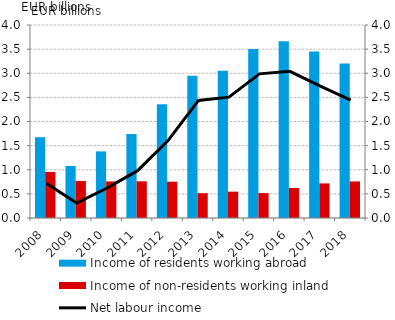
| Category | Income of residents working abroad | Income of non-residents working inland |
|---|---|---|
| 2008.0 | 1.674 | 0.955 |
| 2009.0 | 1.079 | 0.769 |
| 2010.0 | 1.38 | 0.758 |
| 2011.0 | 1.741 | 0.761 |
| 2012.0 | 2.359 | 0.753 |
| 2013.0 | 2.95 | 0.514 |
| 2014.0 | 3.051 | 0.546 |
| 2015.0 | 3.504 | 0.517 |
| 2016.0 | 3.662 | 0.622 |
| 2017.0 | 3.449 | 0.717 |
| 2018.0 | 3.201 | 0.758 |